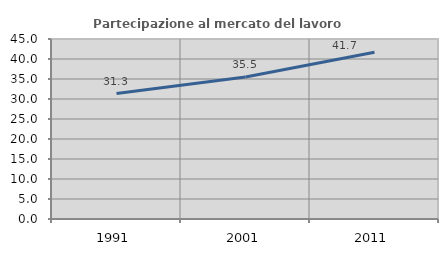
| Category | Partecipazione al mercato del lavoro  femminile |
|---|---|
| 1991.0 | 31.349 |
| 2001.0 | 35.509 |
| 2011.0 | 41.696 |